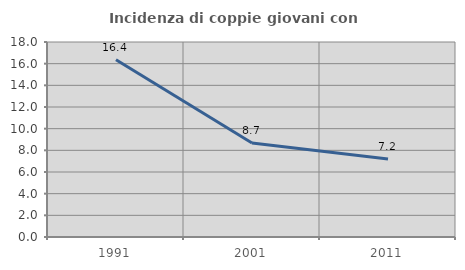
| Category | Incidenza di coppie giovani con figli |
|---|---|
| 1991.0 | 16.361 |
| 2001.0 | 8.668 |
| 2011.0 | 7.192 |